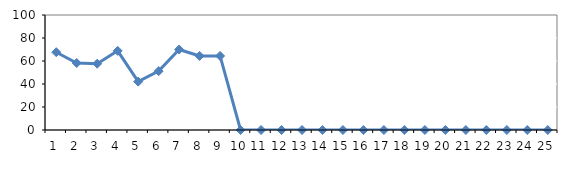
| Category | Series 0 |
|---|---|
| 0 | 67.647 |
| 1 | 58.235 |
| 2 | 57.647 |
| 3 | 68.824 |
| 4 | 42.059 |
| 5 | 51.176 |
| 6 | 70 |
| 7 | 64.412 |
| 8 | 64.412 |
| 9 | 0 |
| 10 | 0 |
| 11 | 0 |
| 12 | 0 |
| 13 | 0 |
| 14 | 0 |
| 15 | 0 |
| 16 | 0 |
| 17 | 0 |
| 18 | 0 |
| 19 | 0 |
| 20 | 0 |
| 21 | 0 |
| 22 | 0 |
| 23 | 0 |
| 24 | 0 |